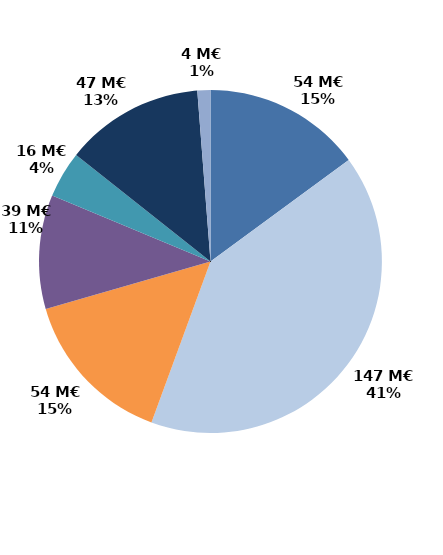
| Category | Series 0 |
|---|---|
| Accueil et information (CEP 1) | 53.897 |
| Accompagnement renforcé (CEP 2 et 3) | 146.968 |
| Suivi | 53.947 |
| Missions locales | 38.834 |
| CSP | 15.892 |
| Aide à la création d'entreprise | 47.318 |
| Aide à l'insertion | 4.442 |